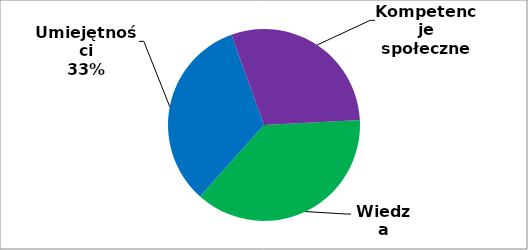
| Category | Series 0 |
|---|---|
| 0 | 82 |
| 1 | 72 |
| 2 | 65 |